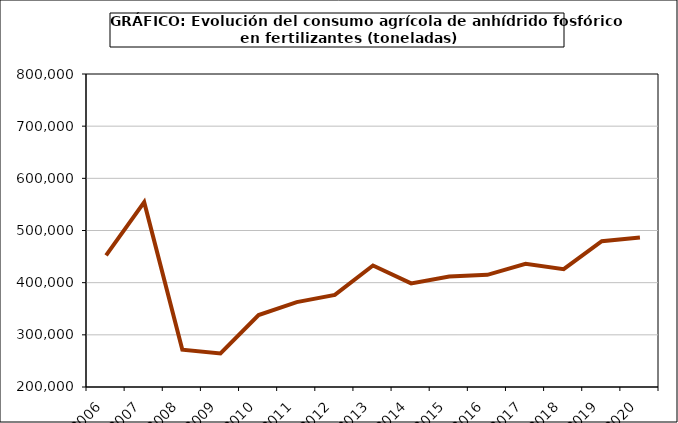
| Category | fertilizantes |
|---|---|
| 2006.0 | 452461 |
| 2007.0 | 554382 |
| 2008.0 | 271578 |
| 2009.0 | 264211 |
| 2010.0 | 337812 |
| 2011.0 | 362672 |
| 2012.0 | 376590 |
| 2013.0 | 432904 |
| 2014.0 | 398580 |
| 2015.0 | 411763 |
| 2016.0 | 414974 |
| 2017.0 | 436110 |
| 2018.0 | 425960 |
| 2019.0 | 479562 |
| 2020.0 | 486618 |